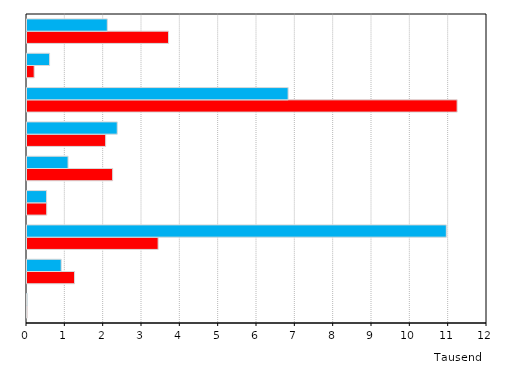
| Category | Series 0 | Series 1 |
|---|---|---|
| Außerhalb der Studien-
bereichsgliederung | 0.003 | 0.006 |
| Kunst,
Kunstwissenschaften | 1.24 | 0.892 |
| Ingenieurwissenschaften | 3.421 | 10.939 |
| Agrar-, Forst- und
Ernährungswissenschaften, Veterinärmedizin | 0.514 | 0.51 |
| Humanmedizin/
Gesundheitswissenschaften | 2.234 | 1.071 |
| Mathematik,
Naturwissenschaften | 2.052 | 2.354 |
| Rechts-, Wirtschafts-
und Sozialwissenschaften | 11.221 | 6.812 |
| Sport | 0.187 | 0.589 |
| Geisteswissenschaften | 3.692 | 2.095 |